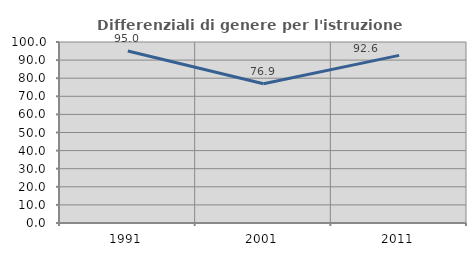
| Category | Differenziali di genere per l'istruzione superiore |
|---|---|
| 1991.0 | 95.026 |
| 2001.0 | 76.889 |
| 2011.0 | 92.624 |